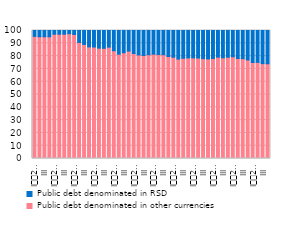
| Category | Public debt denominated in other currencies | Public debt denominated in RSD  |
|---|---|---|
| I
2007 | 95.4 | 4.6 |
| II | 95.1 | 4.9 |
| III | 95.1 | 4.9 |
| IV | 95.1 | 4.9 |
| I
2008 | 97.1 | 2.9 |
| II | 97.1 | 2.9 |
| III | 97.1 | 2.9 |
| IV | 97.5 | 2.5 |
| I
2009 | 96.9 | 3.1 |
| II | 90.7 | 9.3 |
| III | 89.1 | 10.9 |
| IV | 87.2 | 12.8 |
| I
2010 | 87.1 | 12.9 |
| II | 86.2 | 13.8 |
| III | 86.1 | 13.9 |
| IV | 87 | 13 |
| I
2011 | 84.2 | 15.8 |
| II | 81.5 | 18.5 |
| III | 82.6 | 17.4 |
| IV | 83.9 | 16.1 |
| I
2012 | 82 | 18 |
| II | 80.9 | 19.1 |
| III | 80.5 | 19.5 |
| IV | 81.1 | 18.9 |
| I
2013 | 81.5 | 18.5 |
| II | 81.2 | 18.8 |
| III | 81.1 | 18.9 |
| IV | 79.7 | 20.3 |
| I
2014 | 79.1 | 20.9 |
| II | 77.7 | 22.3 |
| III | 78.3 | 21.7 |
| IV | 78.6 | 21.4 |
| I
2015 | 78.6 | 21.4 |
| II | 78.5 | 21.5 |
| III | 78 | 22 |
| IV | 77.8 | 22.2 |
| I
2016 | 78.138 | 21.862 |
| II | 79.184 | 20.816 |
| III | 78.654 | 21.346 |
| IV | 79.122 | 20.877 |
| I
2017 | 79.5 | 20.5 |
| II | 78.1 | 21.9 |
| III | 78 | 22 |
| IV | 77 | 23 |
| I
2018 | 75 | 25 |
| II | 75.1 | 24.9 |
| III | 74.1 | 25.9 |
| IV | 74 | 26 |